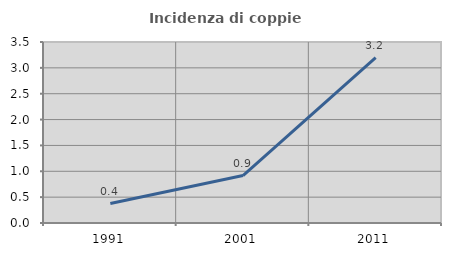
| Category | Incidenza di coppie miste |
|---|---|
| 1991.0 | 0.376 |
| 2001.0 | 0.917 |
| 2011.0 | 3.197 |